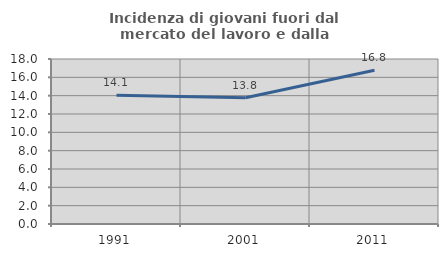
| Category | Incidenza di giovani fuori dal mercato del lavoro e dalla formazione  |
|---|---|
| 1991.0 | 14.059 |
| 2001.0 | 13.774 |
| 2011.0 | 16.772 |